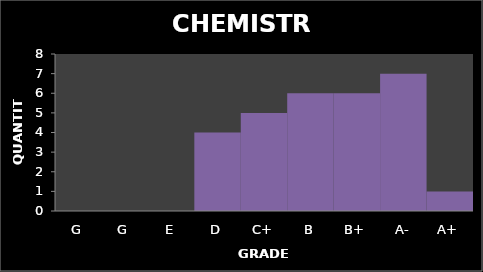
| Category | Quantity |
|---|---|
| G | 0 |
| G | 0 |
| E | 0 |
| D | 4 |
| C+ | 5 |
| B | 6 |
| B+ | 6 |
| A- | 7 |
| A+ | 1 |